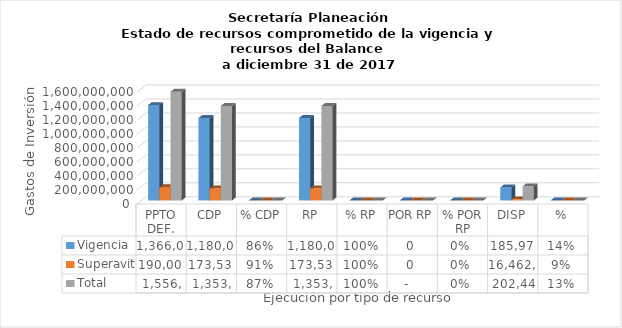
| Category | Vigencia | Superavit | Total |
|---|---|---|---|
| PPTO DEF. | 1366000000 | 190000000 | 1556000000 |
| CDP | 1180021287.23 | 173537999 | 1353559286.23 |
| % CDP | 0.864 | 0.913 | 0.87 |
| RP | 1180021287.23 | 173537999 | 1353559286.23 |
| % RP | 1 | 1 | 1 |
| POR RP | 0 | 0 | 0 |
| % POR RP | 0 | 0 | 0 |
| DISP | 185978712.77 | 16462001 | 202440713.77 |
| % | 0.136 | 0.087 | 0.13 |